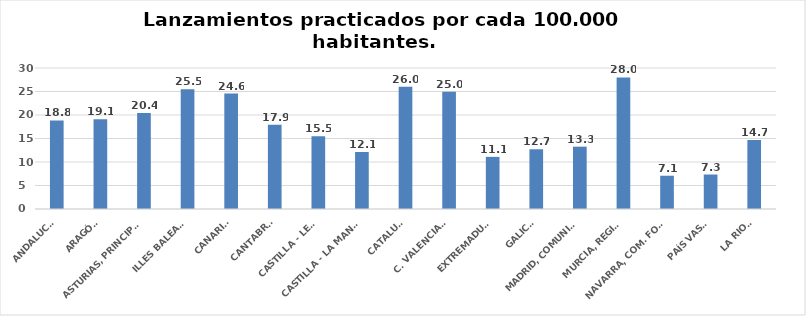
| Category | Series 0 |
|---|---|
| ANDALUCÍA | 18.838 |
| ARAGÓN | 19.075 |
| ASTURIAS, PRINCIPADO | 20.404 |
| ILLES BALEARS | 25.496 |
| CANARIAS | 24.567 |
| CANTABRIA | 17.936 |
| CASTILLA - LEÓN | 15.468 |
| CASTILLA - LA MANCHA | 12.127 |
| CATALUÑA | 25.999 |
| C. VALENCIANA | 24.951 |
| EXTREMADURA | 11.092 |
| GALICIA | 12.712 |
| MADRID, COMUNIDAD | 13.259 |
| MURCIA, REGIÓN | 28.005 |
| NAVARRA, COM. FORAL | 7.077 |
| PAÍS VASCO | 7.336 |
| LA RIOJA | 14.692 |